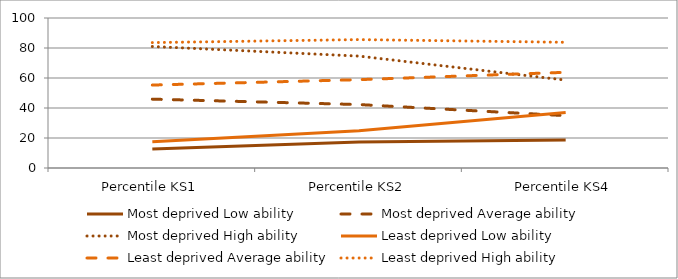
| Category | Most deprived Low ability | Most deprived Average ability | Most deprived High ability | Least deprived Low ability | Least deprived Average ability | Least deprived High ability |
|---|---|---|---|---|---|---|
| Percentile KS1 | 12.6 | 45.9 | 81 | 17.5 | 55.3 | 83.6 |
| Percentile KS2 | 17.3 | 42.3 | 74.6 | 24.9 | 58.9 | 85.6 |
| Percentile KS4 | 18.7 | 34.9 | 58.6 | 37 | 63.8 | 83.8 |